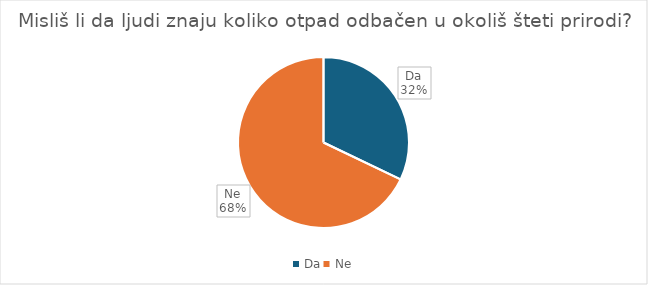
| Category | Series 0 |
|---|---|
| Da | 35 |
| Ne | 74 |